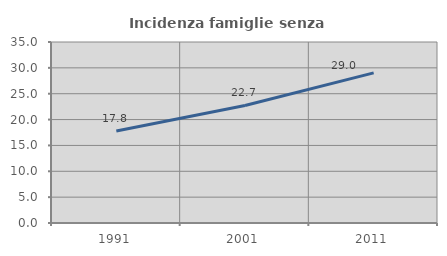
| Category | Incidenza famiglie senza nuclei |
|---|---|
| 1991.0 | 17.783 |
| 2001.0 | 22.724 |
| 2011.0 | 29.03 |